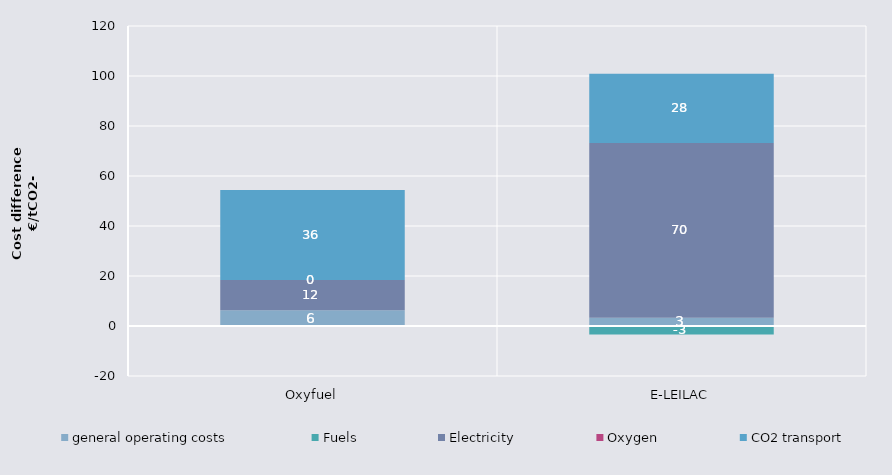
| Category | general operating costs | Fuels | Electricity | Oxygen | CO2 transport |
|---|---|---|---|---|---|
| Oxyfuel | 6.307 | 0 | 12.104 | 0 | 36 |
| E-LEILAC | 3.276 | -3.37 | 69.887 | 0 | 27.775 |